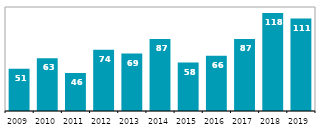
| Category | CZK billion |
|---|---|
| 2009 | 50.758 |
| 2010 | 63.272 |
| 2011 | 45.697 |
| 2012 | 73.73 |
| 2013 | 68.997 |
| 2014 | 86.674 |
| 2015 | 58.16 |
| 2016 | 66.261 |
| 2017 | 86.543 |
| 2018 | 117.893 |
| 2019 | 111.03 |